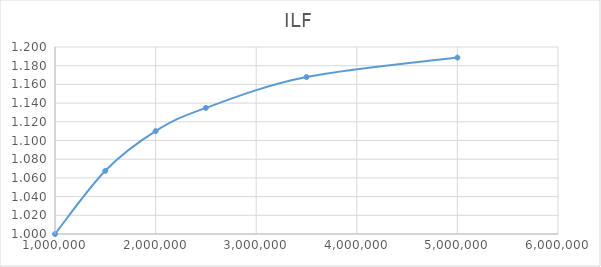
| Category | ILF |
|---|---|
| 1000000.0 | 1 |
| 1500000.0 | 1.068 |
| 2000000.0 | 1.11 |
| 2500000.0 | 1.135 |
| 3500000.0 | 1.168 |
| 5000000.0 | 1.189 |